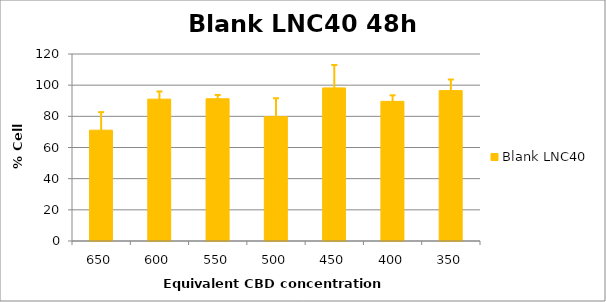
| Category | Blank LNC40 |
|---|---|
| 650.0 | 71.1 |
| 600.0 | 91.039 |
| 550.0 | 91.275 |
| 500.0 | 79.794 |
| 450.0 | 98.235 |
| 400.0 | 89.607 |
| 350.0 | 96.516 |